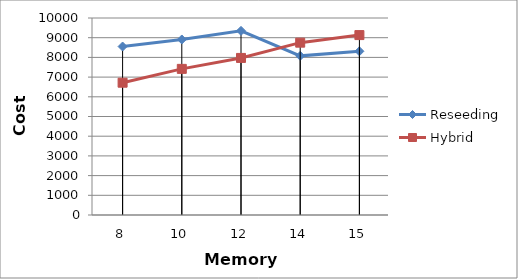
| Category | Reseeding | Hybrid |
|---|---|---|
| 8.0 | 8552 | 6715 |
| 10.0 | 8910 | 7418 |
| 12.0 | 9348 | 7973 |
| 14.0 | 8078 | 8748 |
| 15.0 | 8310 | 9133 |